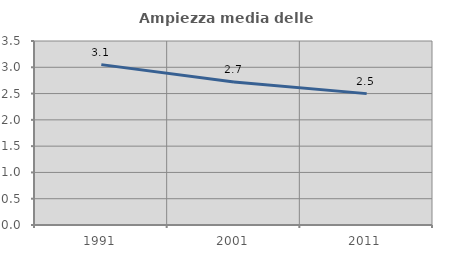
| Category | Ampiezza media delle famiglie |
|---|---|
| 1991.0 | 3.051 |
| 2001.0 | 2.718 |
| 2011.0 | 2.499 |